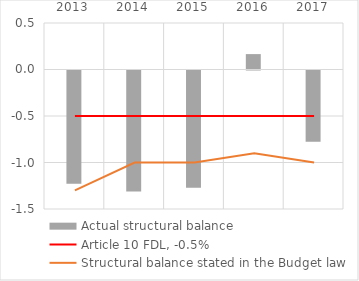
| Category | Actual structural balance |
|---|---|
| 2013.0 | -1.217 |
| 2014.0 | -1.302 |
| 2015.0 | -1.26 |
| 2016.0 | 0.166 |
| 2017.0 | -0.767 |